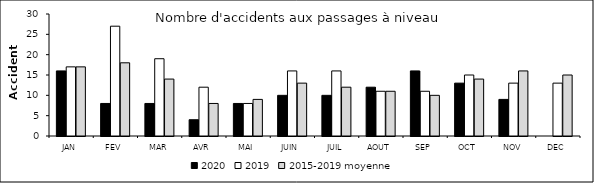
| Category | 2020 | 2019 | 2015-2019 moyenne |
|---|---|---|---|
| JAN | 16 | 17 | 17 |
| FEV | 8 | 27 | 18 |
| MAR | 8 | 19 | 14 |
| AVR | 4 | 12 | 8 |
| MAI | 8 | 8 | 9 |
| JUIN | 10 | 16 | 13 |
| JUIL | 10 | 16 | 12 |
| AOUT | 12 | 11 | 11 |
| SEP | 16 | 11 | 10 |
| OCT | 13 | 15 | 14 |
| NOV | 9 | 13 | 16 |
| DEC | 0 | 13 | 15 |